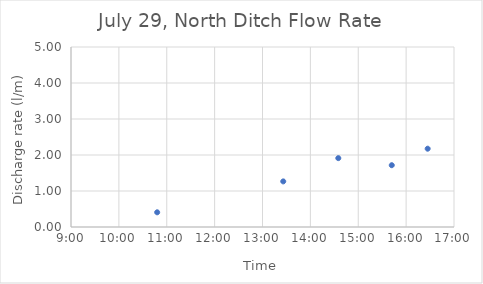
| Category | Series 0 |
|---|---|
| 0.45 | 0.408 |
| 0.5597222222222222 | 1.267 |
| 0.607638888888889 | 1.913 |
| 0.6541666666666667 | 1.716 |
| 0.6854166666666667 | 2.175 |